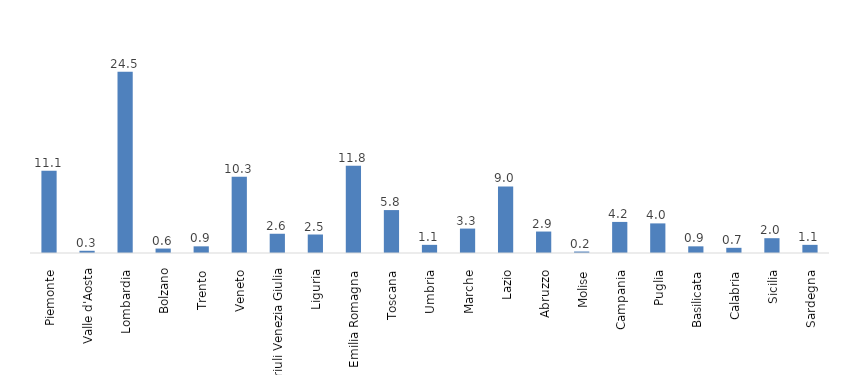
| Category | Series 0 |
|---|---|
| Piemonte  | 11.1 |
| Valle d'Aosta | 0.3 |
| Lombardia  | 24.5 |
| Bolzano | 0.6 |
| Trento  | 0.9 |
| Veneto  | 10.3 |
| Friuli Venezia Giulia | 2.6 |
| Liguria  | 2.5 |
| Emilia Romagna  | 11.8 |
| Toscana  | 5.8 |
| Umbria  | 1.1 |
| Marche  | 3.3 |
| Lazio  | 9 |
| Abruzzo  | 2.9 |
| Molise  | 0.2 |
| Campania  | 4.2 |
| Puglia  | 4 |
| Basilicata  | 0.9 |
| Calabria  | 0.7 |
| Sicilia  | 2 |
| Sardegna  | 1.1 |